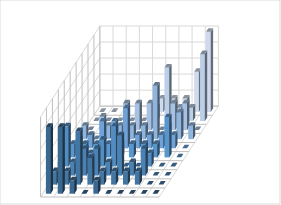
| Category | Series 0 | Series 1 | Series 2 | Series 3 | Series 4 | Series 5 | Series 6 | Series 7 | Series 8 | Series 9 |
|---|---|---|---|---|---|---|---|---|---|---|
| 0 | 0 | 0 | 0 | 0.008 | 0 | 0.008 | 0.025 | 0.008 | 0.008 | 0.042 |
| 1 | 0 | 0 | 0.008 | 0 | 0.008 | 0.008 | 0.017 | 0.008 | 0.008 | 0.042 |
| 2 | 0 | 0 | 0 | 0.008 | 0.017 | 0.008 | 0.008 | 0.017 | 0.033 | 0.008 |
| 3 | 0 | 0 | 0.017 | 0.008 | 0.017 | 0.008 | 0.017 | 0.017 | 0.017 | 0 |
| 4 | 0 | 0 | 0.017 | 0.008 | 0.025 | 0.008 | 0.025 | 0.008 | 0.008 | 0.008 |
| 5 | 0.008 | 0.008 | 0.017 | 0.008 | 0.008 | 0.008 | 0 | 0.025 | 0.008 | 0 |
| 6 | 0.008 | 0.033 | 0 | 0.033 | 0.008 | 0.008 | 0 | 0.008 | 0.008 | 0 |
| 7 | 0.008 | 0.008 | 0.017 | 0.008 | 0.008 | 0.008 | 0.008 | 0.017 | 0.008 | 0 |
| 8 | 0.025 | 0.008 | 0.017 | 0.017 | 0.008 | 0.025 | 0 | 0 | 0 | 0 |
| 9 | 0.05 | 0.042 | 0 | 0.008 | 0 | 0 | 0 | 0 | 0 | 0 |